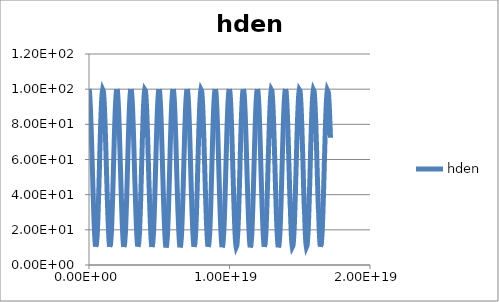
| Category | hden |
|---|---|
| 47421200000000.0 | 100 |
| 284527000000000.0 | 100 |
| 1232950000000000.0 | 99.996 |
| 5026650000000000.0 | 99.942 |
| 1.2007e+16 | 99.774 |
| 2.10816e+16 | 99.391 |
| 3.28784e+16 | 98.618 |
| 4.82144e+16 | 97.156 |
| 6.81511e+16 | 94.513 |
| 9.19197e+16 | 90.657 |
| 1.1692e+17 | 85.924 |
| 1.4192e+17 | 80.429 |
| 1.6692e+17 | 74.308 |
| 1.9192e+17 | 67.712 |
| 2.16501e+17 | 61.038 |
| 2.39133e+17 | 55.09 |
| 2.59097e+17 | 49.778 |
| 2.77106e+17 | 44.99 |
| 2.93684e+17 | 40.646 |
| 3.09152e+17 | 36.705 |
| 3.23729e+17 | 33.117 |
| 3.37601e+17 | 29.852 |
| 3.50903e+17 | 26.88 |
| 3.63764e+17 | 24.175 |
| 3.75989e+17 | 21.835 |
| 3.87677e+17 | 19.709 |
| 3.99209e+17 | 17.791 |
| 4.12395e+17 | 15.587 |
| 4.25562e+17 | 14.13 |
| 4.38707e+17 | 12.553 |
| 4.52783e+17 | 11.454 |
| 4.6807e+17 | 10.481 |
| 4.87942e+17 | 10.001 |
| 5.11675e+17 | 10.518 |
| 5.36675e+17 | 12.131 |
| 5.61675e+17 | 14.799 |
| 5.80268e+17 | 16.464 |
| 5.92436e+17 | 18.349 |
| 6.04271e+17 | 20.332 |
| 6.17516e+17 | 23.181 |
| 6.30871e+17 | 25.612 |
| 6.4437e+17 | 29.009 |
| 6.58497e+17 | 32.092 |
| 6.73441e+17 | 36.324 |
| 6.89322e+17 | 40.225 |
| 7.0402e+17 | 44.16 |
| 7.20723e+17 | 49.406 |
| 7.38614e+17 | 54.17 |
| 7.58051e+17 | 60.37 |
| 7.79392e+17 | 66.122 |
| 7.99955e+17 | 71.608 |
| 8.22662e+17 | 77.946 |
| 8.47662e+17 | 83.719 |
| 8.72662e+17 | 88.785 |
| 8.97662e+17 | 93.019 |
| 9.22662e+17 | 96.317 |
| 9.47662e+17 | 98.598 |
| 9.72662e+17 | 99.805 |
| 9.97662e+17 | 99.908 |
| 1.02266e+18 | 98.906 |
| 1.04766e+18 | 96.823 |
| 1.07266e+18 | 93.71 |
| 1.09766e+18 | 89.644 |
| 1.12266e+18 | 84.725 |
| 1.14766e+18 | 79.073 |
| 1.17266e+18 | 72.829 |
| 1.19766e+18 | 66.147 |
| 1.22156e+18 | 59.807 |
| 1.24313e+18 | 54.069 |
| 1.26244e+18 | 48.913 |
| 1.28e+18 | 44.245 |
| 1.29624e+18 | 40.006 |
| 1.31142e+18 | 36.152 |
| 1.32577e+18 | 32.639 |
| 1.33945e+18 | 29.44 |
| 1.35259e+18 | 26.524 |
| 1.3653e+18 | 23.875 |
| 1.37769e+18 | 21.468 |
| 1.38951e+18 | 19.409 |
| 1.40087e+18 | 17.539 |
| 1.41391e+18 | 15.393 |
| 1.42696e+18 | 13.971 |
| 1.44002e+18 | 12.435 |
| 1.45405e+18 | 11.364 |
| 1.46936e+18 | 10.429 |
| 1.48925e+18 | 10 |
| 1.513e+18 | 10.576 |
| 1.538e+18 | 12.246 |
| 1.563e+18 | 14.969 |
| 1.58167e+18 | 16.682 |
| 1.59368e+18 | 18.513 |
| 1.6071e+18 | 21.187 |
| 1.62046e+18 | 23.426 |
| 1.63372e+18 | 26.582 |
| 1.64752e+18 | 29.43 |
| 1.662e+18 | 33.368 |
| 1.67732e+18 | 36.988 |
| 1.69141e+18 | 40.653 |
| 1.70739e+18 | 45.576 |
| 1.72443e+18 | 50.047 |
| 1.74286e+18 | 55.928 |
| 1.76294e+18 | 61.37 |
| 1.78209e+18 | 66.619 |
| 1.80389e+18 | 73.185 |
| 1.82788e+18 | 79.004 |
| 1.85205e+18 | 84.663 |
| 1.87705e+18 | 89.592 |
| 1.90205e+18 | 93.668 |
| 1.92705e+18 | 96.793 |
| 1.95205e+18 | 98.888 |
| 1.97705e+18 | 99.903 |
| 2.00205e+18 | 99.812 |
| 2.02705e+18 | 98.618 |
| 2.05205e+18 | 96.349 |
| 2.07705e+18 | 93.063 |
| 2.10205e+18 | 88.839 |
| 2.12705e+18 | 83.782 |
| 2.15205e+18 | 78.017 |
| 2.17705e+18 | 71.684 |
| 2.20205e+18 | 64.941 |
| 2.22705e+18 | 57.953 |
| 2.24922e+18 | 52.487 |
| 2.26774e+18 | 47.519 |
| 2.28474e+18 | 43.017 |
| 2.30052e+18 | 38.925 |
| 2.31533e+18 | 35.198 |
| 2.32936e+18 | 31.802 |
| 2.34275e+18 | 28.708 |
| 2.35564e+18 | 25.889 |
| 2.36812e+18 | 23.325 |
| 2.3803e+18 | 20.998 |
| 2.39229e+18 | 18.885 |
| 2.40386e+18 | 17.087 |
| 2.41675e+18 | 15.03 |
| 2.42971e+18 | 13.657 |
| 2.44278e+18 | 12.188 |
| 2.45694e+18 | 11.164 |
| 2.47252e+18 | 10.309 |
| 2.49278e+18 | 10.016 |
| 2.51672e+18 | 10.757 |
| 2.54172e+18 | 12.587 |
| 2.56672e+18 | 15.461 |
| 2.58536e+18 | 17.233 |
| 2.59735e+18 | 19.133 |
| 2.61081e+18 | 21.892 |
| 2.62431e+18 | 24.236 |
| 2.63785e+18 | 27.532 |
| 2.65198e+18 | 30.521 |
| 2.66688e+18 | 34.646 |
| 2.68195e+18 | 38.067 |
| 2.69724e+18 | 42.687 |
| 2.71364e+18 | 46.957 |
| 2.73148e+18 | 52.616 |
| 2.74993e+18 | 57.345 |
| 2.76918e+18 | 63.447 |
| 2.78953e+18 | 68.636 |
| 2.81131e+18 | 75.083 |
| 2.83584e+18 | 81.001 |
| 2.86055e+18 | 86.427 |
| 2.88555e+18 | 91.078 |
| 2.91055e+18 | 94.841 |
| 2.93555e+18 | 97.624 |
| 2.96055e+18 | 99.356 |
| 2.98555e+18 | 99.997 |
| 3.01055e+18 | 99.529 |
| 3.03555e+18 | 97.965 |
| 3.06055e+18 | 95.343 |
| 3.08555e+18 | 91.728 |
| 3.11055e+18 | 87.208 |
| 3.13555e+18 | 81.895 |
| 3.16055e+18 | 75.92 |
| 3.18555e+18 | 69.43 |
| 3.21055e+18 | 62.585 |
| 3.23555e+18 | 55.553 |
| 3.26055e+18 | 48.507 |
| 3.28104e+18 | 44.072 |
| 3.29671e+18 | 39.924 |
| 3.31157e+18 | 36.154 |
| 3.32562e+18 | 32.715 |
| 3.339e+18 | 29.579 |
| 3.35185e+18 | 26.72 |
| 3.36427e+18 | 24.116 |
| 3.37636e+18 | 21.748 |
| 3.38823e+18 | 19.596 |
| 3.39999e+18 | 17.646 |
| 3.41348e+18 | 15.416 |
| 3.42664e+18 | 14.025 |
| 3.43937e+18 | 12.513 |
| 3.45303e+18 | 11.449 |
| 3.46793e+18 | 10.496 |
| 3.48728e+18 | 10.003 |
| 3.51072e+18 | 10.478 |
| 3.53572e+18 | 12.05 |
| 3.56072e+18 | 14.679 |
| 3.57924e+18 | 16.302 |
| 3.59123e+18 | 18.136 |
| 3.60316e+18 | 20.168 |
| 3.61685e+18 | 23.099 |
| 3.63065e+18 | 25.606 |
| 3.64459e+18 | 29.116 |
| 3.65922e+18 | 32.332 |
| 3.67261e+18 | 35.647 |
| 3.68786e+18 | 40.153 |
| 3.70396e+18 | 44.201 |
| 3.72114e+18 | 49.601 |
| 3.73885e+18 | 54.108 |
| 3.75723e+18 | 59.973 |
| 3.77676e+18 | 65.062 |
| 3.79776e+18 | 71.469 |
| 3.82095e+18 | 77.237 |
| 3.84476e+18 | 83.083 |
| 3.86976e+18 | 88.238 |
| 3.89476e+18 | 92.574 |
| 3.91976e+18 | 95.985 |
| 3.94476e+18 | 98.387 |
| 3.96976e+18 | 99.721 |
| 3.99476e+18 | 99.953 |
| 4.01976e+18 | 99.079 |
| 4.04476e+18 | 97.119 |
| 4.06976e+18 | 94.122 |
| 4.09476e+18 | 90.162 |
| 4.11976e+18 | 85.336 |
| 4.14476e+18 | 79.763 |
| 4.16976e+18 | 73.58 |
| 4.19476e+18 | 66.939 |
| 4.21976e+18 | 60.005 |
| 4.24476e+18 | 52.948 |
| 4.26976e+18 | 45.941 |
| 4.28979e+18 | 41.82 |
| 4.30462e+18 | 37.927 |
| 4.31884e+18 | 34.385 |
| 4.33232e+18 | 31.151 |
| 4.34522e+18 | 28.198 |
| 4.35765e+18 | 25.504 |
| 4.36971e+18 | 23.049 |
| 4.38149e+18 | 20.815 |
| 4.39309e+18 | 18.785 |
| 4.40463e+18 | 16.945 |
| 4.4179e+18 | 14.854 |
| 4.43095e+18 | 13.534 |
| 4.44372e+18 | 12.122 |
| 4.45761e+18 | 11.128 |
| 4.47297e+18 | 10.299 |
| 4.49294e+18 | 10.016 |
| 4.51673e+18 | 10.757 |
| 4.54173e+18 | 12.587 |
| 4.56673e+18 | 15.461 |
| 4.58505e+18 | 17.137 |
| 4.59844e+18 | 19.618 |
| 4.61191e+18 | 21.778 |
| 4.6255e+18 | 24.858 |
| 4.63953e+18 | 27.617 |
| 4.65207e+18 | 30.474 |
| 4.66631e+18 | 34.408 |
| 4.68117e+18 | 37.908 |
| 4.69686e+18 | 42.641 |
| 4.71364e+18 | 47.002 |
| 4.72917e+18 | 51.268 |
| 4.74668e+18 | 56.857 |
| 4.76529e+18 | 61.763 |
| 4.78535e+18 | 68.01 |
| 4.80757e+18 | 73.764 |
| 4.83095e+18 | 79.931 |
| 4.85595e+18 | 85.485 |
| 4.88095e+18 | 90.288 |
| 4.90595e+18 | 94.221 |
| 4.93095e+18 | 97.19 |
| 4.95595e+18 | 99.119 |
| 4.98095e+18 | 99.962 |
| 5.00595e+18 | 99.698 |
| 5.03095e+18 | 98.333 |
| 5.05595e+18 | 95.901 |
| 5.08095e+18 | 92.462 |
| 5.10595e+18 | 88.101 |
| 5.13095e+18 | 82.925 |
| 5.15595e+18 | 77.061 |
| 5.18095e+18 | 70.654 |
| 5.20595e+18 | 63.861 |
| 5.23095e+18 | 56.85 |
| 5.25595e+18 | 49.794 |
| 5.28095e+18 | 42.866 |
| 5.30527e+18 | 36.588 |
| 5.32343e+18 | 33.377 |
| 5.33802e+18 | 29.41 |
| 5.3522e+18 | 26.725 |
| 5.36405e+18 | 24.204 |
| 5.37573e+18 | 21.906 |
| 5.38719e+18 | 19.815 |
| 5.39851e+18 | 17.917 |
| 5.41148e+18 | 15.729 |
| 5.42448e+18 | 14.266 |
| 5.4375e+18 | 12.674 |
| 5.45102e+18 | 11.619 |
| 5.4652e+18 | 10.636 |
| 5.48363e+18 | 10.031 |
| 5.50655e+18 | 10.322 |
| 5.53155e+18 | 11.713 |
| 5.55655e+18 | 14.169 |
| 5.57546e+18 | 15.824 |
| 5.58804e+18 | 17.657 |
| 5.60031e+18 | 19.689 |
| 5.61434e+18 | 22.638 |
| 5.62847e+18 | 25.171 |
| 5.64068e+18 | 27.797 |
| 5.65449e+18 | 31.44 |
| 5.66884e+18 | 34.665 |
| 5.68387e+18 | 39.058 |
| 5.69914e+18 | 42.692 |
| 5.71471e+18 | 47.546 |
| 5.73116e+18 | 51.838 |
| 5.74875e+18 | 57.456 |
| 5.7676e+18 | 62.46 |
| 5.78809e+18 | 68.818 |
| 5.81075e+18 | 74.626 |
| 5.83433e+18 | 80.719 |
| 5.85933e+18 | 86.179 |
| 5.88433e+18 | 90.871 |
| 5.90933e+18 | 94.68 |
| 5.93433e+18 | 97.512 |
| 5.95933e+18 | 99.297 |
| 5.98433e+18 | 99.991 |
| 6.00933e+18 | 99.578 |
| 6.03433e+18 | 98.066 |
| 6.05933e+18 | 95.495 |
| 6.08433e+18 | 91.926 |
| 6.10933e+18 | 87.448 |
| 6.13433e+18 | 82.171 |
| 6.15933e+18 | 76.225 |
| 6.18433e+18 | 69.756 |
| 6.20933e+18 | 62.924 |
| 6.23433e+18 | 55.897 |
| 6.25933e+18 | 48.848 |
| 6.28421e+18 | 42.014 |
| 6.30782e+18 | 36.083 |
| 6.3295e+18 | 30.9 |
| 6.34572e+18 | 28.211 |
| 6.35898e+18 | 24.929 |
| 6.37182e+18 | 22.751 |
| 6.3841e+18 | 20.139 |
| 6.39624e+18 | 18.358 |
| 6.40818e+18 | 16.277 |
| 6.42045e+18 | 14.781 |
| 6.43314e+18 | 13.127 |
| 6.4465e+18 | 11.974 |
| 6.46073e+18 | 10.864 |
| 6.47922e+18 | 10.095 |
| 6.50217e+18 | 10.191 |
| 6.52717e+18 | 11.391 |
| 6.55217e+18 | 13.664 |
| 6.57152e+18 | 15.347 |
| 6.58471e+18 | 17.164 |
| 6.59725e+18 | 19.179 |
| 6.61155e+18 | 22.124 |
| 6.62523e+18 | 24.37 |
| 6.63814e+18 | 27.516 |
| 6.65163e+18 | 30.373 |
| 6.66589e+18 | 34.307 |
| 6.68024e+18 | 37.525 |
| 6.6947e+18 | 41.869 |
| 6.70989e+18 | 45.712 |
| 6.72604e+18 | 50.812 |
| 6.74331e+18 | 55.411 |
| 6.76204e+18 | 61.376 |
| 6.78237e+18 | 66.77 |
| 6.80462e+18 | 73.42 |
| 6.82875e+18 | 79.201 |
| 6.85287e+18 | 84.838 |
| 6.87787e+18 | 89.74 |
| 6.90287e+18 | 93.787 |
| 6.92787e+18 | 96.879 |
| 6.95287e+18 | 98.939 |
| 6.97787e+18 | 99.918 |
| 7.00287e+18 | 99.79 |
| 7.02787e+18 | 98.56 |
| 7.05287e+18 | 96.257 |
| 7.07787e+18 | 92.938 |
| 7.10287e+18 | 88.685 |
| 7.12787e+18 | 83.603 |
| 7.15287e+18 | 77.816 |
| 7.17787e+18 | 71.467 |
| 7.20287e+18 | 64.714 |
| 7.22787e+18 | 57.72 |
| 7.25287e+18 | 50.66 |
| 7.2775e+18 | 43.911 |
| 7.30063e+18 | 38.006 |
| 7.32187e+18 | 32.8 |
| 7.34178e+18 | 28.22 |
| 7.35691e+18 | 25.802 |
| 7.36948e+18 | 22.866 |
| 7.38172e+18 | 20.9 |
| 7.39354e+18 | 18.558 |
| 7.40529e+18 | 16.95 |
| 7.41697e+18 | 15.09 |
| 7.42898e+18 | 13.769 |
| 7.44144e+18 | 12.337 |
| 7.45498e+18 | 11.312 |
| 7.46991e+18 | 10.416 |
| 7.48932e+18 | 10 |
| 7.51279e+18 | 10.567 |
| 7.53779e+18 | 12.228 |
| 7.56279e+18 | 14.942 |
| 7.58162e+18 | 16.698 |
| 7.59618e+18 | 19.34 |
| 7.61064e+18 | 21.597 |
| 7.6227e+18 | 23.892 |
| 7.6361e+18 | 27.123 |
| 7.64988e+18 | 29.963 |
| 7.66215e+18 | 32.878 |
| 7.67608e+18 | 36.857 |
| 7.69046e+18 | 40.278 |
| 7.70541e+18 | 44.869 |
| 7.72134e+18 | 49.027 |
| 7.73853e+18 | 54.507 |
| 7.75708e+18 | 59.492 |
| 7.77739e+18 | 65.88 |
| 7.79897e+18 | 71.323 |
| 7.82158e+18 | 77.682 |
| 7.84658e+18 | 83.483 |
| 7.87158e+18 | 88.582 |
| 7.89658e+18 | 92.854 |
| 7.92158e+18 | 96.195 |
| 7.94658e+18 | 98.521 |
| 7.97158e+18 | 99.775 |
| 7.99658e+18 | 99.927 |
| 8.02158e+18 | 98.972 |
| 8.04658e+18 | 96.935 |
| 8.07158e+18 | 93.865 |
| 8.09658e+18 | 89.839 |
| 8.12158e+18 | 84.954 |
| 8.14658e+18 | 79.332 |
| 8.17158e+18 | 73.111 |
| 8.19658e+18 | 66.443 |
| 8.22158e+18 | 59.494 |
| 8.24658e+18 | 52.435 |
| 8.27085e+18 | 45.839 |
| 8.29331e+18 | 40.023 |
| 8.31394e+18 | 34.851 |
| 8.33327e+18 | 30.256 |
| 8.35163e+18 | 26.184 |
| 8.36928e+18 | 22.594 |
| 8.383e+18 | 20.684 |
| 8.39458e+18 | 18.408 |
| 8.40616e+18 | 16.825 |
| 8.41775e+18 | 14.996 |
| 8.42961e+18 | 13.71 |
| 8.44182e+18 | 12.315 |
| 8.45498e+18 | 11.328 |
| 8.46937e+18 | 10.449 |
| 8.48807e+18 | 10.002 |
| 8.51115e+18 | 10.496 |
| 8.53615e+18 | 12.086 |
| 8.56115e+18 | 14.732 |
| 8.58026e+18 | 16.539 |
| 8.59268e+18 | 18.343 |
| 8.60602e+18 | 20.979 |
| 8.61931e+18 | 23.193 |
| 8.63253e+18 | 26.317 |
| 8.64561e+18 | 28.828 |
| 8.6585e+18 | 32.286 |
| 8.67195e+18 | 35.355 |
| 8.6861e+18 | 39.519 |
| 8.70105e+18 | 43.26 |
| 8.71702e+18 | 48.253 |
| 8.73369e+18 | 52.552 |
| 8.75128e+18 | 58.169 |
| 8.76991e+18 | 63.044 |
| 8.78991e+18 | 69.23 |
| 8.81186e+18 | 74.801 |
| 8.83501e+18 | 80.879 |
| 8.86001e+18 | 86.319 |
| 8.88501e+18 | 90.988 |
| 8.91001e+18 | 94.771 |
| 8.93501e+18 | 97.575 |
| 8.96001e+18 | 99.331 |
| 8.98501e+18 | 99.995 |
| 9.01001e+18 | 99.55 |
| 9.03501e+18 | 98.009 |
| 9.06001e+18 | 95.409 |
| 9.08501e+18 | 91.814 |
| 9.11001e+18 | 87.313 |
| 9.13501e+18 | 82.016 |
| 9.16001e+18 | 76.053 |
| 9.18501e+18 | 69.572 |
| 9.21001e+18 | 62.733 |
| 9.23501e+18 | 55.703 |
| 9.25916e+18 | 49.135 |
| 9.28128e+18 | 43.328 |
| 9.30145e+18 | 38.133 |
| 9.32027e+18 | 33.474 |
| 9.33807e+18 | 29.298 |
| 9.35512e+18 | 25.564 |
| 9.37163e+18 | 22.241 |
| 9.38779e+18 | 19.303 |
| 9.40063e+18 | 17.709 |
| 9.41172e+18 | 15.843 |
| 9.42308e+18 | 14.505 |
| 9.43479e+18 | 13.014 |
| 9.44712e+18 | 11.963 |
| 9.46023e+18 | 10.927 |
| 9.47727e+18 | 10.152 |
| 9.4994e+18 | 10.126 |
| 9.5244e+18 | 11.204 |
| 9.5494e+18 | 13.361 |
| 9.5744e+18 | 16.543 |
| 9.59244e+18 | 18.262 |
| 9.60518e+18 | 20.76 |
| 9.61832e+18 | 23.033 |
| 9.62985e+18 | 25.332 |
| 9.64269e+18 | 28.537 |
| 9.65585e+18 | 31.311 |
| 9.66945e+18 | 35.11 |
| 9.6837e+18 | 38.504 |
| 9.6988e+18 | 43.08 |
| 9.71444e+18 | 46.998 |
| 9.73079e+18 | 52.182 |
| 9.74797e+18 | 56.673 |
| 9.76625e+18 | 62.48 |
| 9.78623e+18 | 67.792 |
| 9.80837e+18 | 74.383 |
| 9.8327e+18 | 80.184 |
| 9.85703e+18 | 85.708 |
| 9.88203e+18 | 90.475 |
| 9.90703e+18 | 94.37 |
| 9.93203e+18 | 97.294 |
| 9.95703e+18 | 99.178 |
| 9.98203e+18 | 99.973 |
| 1.0007e+19 | 99.662 |
| 1.0032e+19 | 98.25 |
| 1.0057e+19 | 95.774 |
| 1.0082e+19 | 92.293 |
| 1.0107e+19 | 87.894 |
| 1.0132e+19 | 82.686 |
| 1.0157e+19 | 76.795 |
| 1.0182e+19 | 70.368 |
| 1.0207e+19 | 63.563 |
| 1.0232e+19 | 56.546 |
| 1.02555e+19 | 50.341 |
| 1.02764e+19 | 44.825 |
| 1.02954e+19 | 39.87 |
| 1.03132e+19 | 35.396 |
| 1.03299e+19 | 31.352 |
| 1.03459e+19 | 27.695 |
| 1.03614e+19 | 24.397 |
| 1.03765e+19 | 21.434 |
| 1.03914e+19 | 18.787 |
| 1.04085e+19 | 15.821 |
| 1.04257e+19 | 13.902 |
| 1.04383e+19 | 12.821 |
| 1.04499e+19 | 11.67 |
| 1.04629e+19 | 10.831 |
| 1.04777e+19 | 10.172 |
| 1.0497e+19 | 10.055 |
| 1.05203e+19 | 10.954 |
| 1.05453e+19 | 12.939 |
| 1.05703e+19 | 15.959 |
| 1.05887e+19 | 17.716 |
| 1.06001e+19 | 19.55 |
| 1.06128e+19 | 22.188 |
| 1.06255e+19 | 24.403 |
| 1.06382e+19 | 27.5 |
| 1.06513e+19 | 30.24 |
| 1.0665e+19 | 34.007 |
| 1.06791e+19 | 37.219 |
| 1.06935e+19 | 41.557 |
| 1.07088e+19 | 45.443 |
| 1.07252e+19 | 50.605 |
| 1.07426e+19 | 55.224 |
| 1.07614e+19 | 61.219 |
| 1.07816e+19 | 66.501 |
| 1.08035e+19 | 73.11 |
| 1.08278e+19 | 79.027 |
| 1.08521e+19 | 84.683 |
| 1.08771e+19 | 89.609 |
| 1.09021e+19 | 93.682 |
| 1.09271e+19 | 96.803 |
| 1.09521e+19 | 98.894 |
| 1.09771e+19 | 99.905 |
| 1.10021e+19 | 99.81 |
| 1.10271e+19 | 98.611 |
| 1.10521e+19 | 96.339 |
| 1.10771e+19 | 93.049 |
| 1.11021e+19 | 88.822 |
| 1.11271e+19 | 83.762 |
| 1.11521e+19 | 77.994 |
| 1.11771e+19 | 71.659 |
| 1.12021e+19 | 64.915 |
| 1.12271e+19 | 57.926 |
| 1.12521e+19 | 50.866 |
| 1.12746e+19 | 45.291 |
| 1.12938e+19 | 40.295 |
| 1.13115e+19 | 35.818 |
| 1.13274e+19 | 32.145 |
| 1.13419e+19 | 28.773 |
| 1.13559e+19 | 25.703 |
| 1.13696e+19 | 22.913 |
| 1.1383e+19 | 20.383 |
| 1.13964e+19 | 18.098 |
| 1.14117e+19 | 15.517 |
| 1.14272e+19 | 13.809 |
| 1.14429e+19 | 12.044 |
| 1.14604e+19 | 10.851 |
| 1.14801e+19 | 10.068 |
| 1.15038e+19 | 10.235 |
| 1.15288e+19 | 11.505 |
| 1.15538e+19 | 13.846 |
| 1.15726e+19 | 15.416 |
| 1.15849e+19 | 17.13 |
| 1.15966e+19 | 18.995 |
| 1.16082e+19 | 21.049 |
| 1.16215e+19 | 23.985 |
| 1.16349e+19 | 26.488 |
| 1.16485e+19 | 29.975 |
| 1.16623e+19 | 32.951 |
| 1.16765e+19 | 37.016 |
| 1.16915e+19 | 40.659 |
| 1.17074e+19 | 45.552 |
| 1.17242e+19 | 49.937 |
| 1.17423e+19 | 55.704 |
| 1.17617e+19 | 60.88 |
| 1.17828e+19 | 67.481 |
| 1.18059e+19 | 73.387 |
| 1.18295e+19 | 79.586 |
| 1.18545e+19 | 85.179 |
| 1.18795e+19 | 90.029 |
| 1.19045e+19 | 94.017 |
| 1.19295e+19 | 97.044 |
| 1.19545e+19 | 99.036 |
| 1.19795e+19 | 99.943 |
| 1.20045e+19 | 99.744 |
| 1.20295e+19 | 98.443 |
| 1.20545e+19 | 96.072 |
| 1.20795e+19 | 92.69 |
| 1.21045e+19 | 88.38 |
| 1.21295e+19 | 83.248 |
| 1.21545e+19 | 77.42 |
| 1.21795e+19 | 71.041 |
| 1.22045e+19 | 64.266 |
| 1.22295e+19 | 57.263 |
| 1.22545e+19 | 50.205 |
| 1.22781e+19 | 44.004 |
| 1.22989e+19 | 38.8 |
| 1.23173e+19 | 34.299 |
| 1.23337e+19 | 30.585 |
| 1.23484e+19 | 27.306 |
| 1.23622e+19 | 24.423 |
| 1.23754e+19 | 21.84 |
| 1.23878e+19 | 19.669 |
| 1.24014e+19 | 17.14 |
| 1.24149e+19 | 15.46 |
| 1.24266e+19 | 13.992 |
| 1.244e+19 | 12.414 |
| 1.24544e+19 | 11.336 |
| 1.24699e+19 | 10.404 |
| 1.24901e+19 | 10.002 |
| 1.25139e+19 | 10.62 |
| 1.25389e+19 | 12.331 |
| 1.25639e+19 | 15.092 |
| 1.25833e+19 | 17.04 |
| 1.25967e+19 | 19.14 |
| 1.26096e+19 | 21.422 |
| 1.26242e+19 | 24.705 |
| 1.2639e+19 | 27.559 |
| 1.26542e+19 | 31.546 |
| 1.26699e+19 | 35.098 |
| 1.26864e+19 | 39.951 |
| 1.27038e+19 | 44.307 |
| 1.27223e+19 | 50.125 |
| 1.2742e+19 | 55.354 |
| 1.27633e+19 | 62.134 |
| 1.27864e+19 | 68.219 |
| 1.28064e+19 | 72.96 |
| 1.28235e+19 | 77.097 |
| 1.28396e+19 | 80.876 |
| 1.2855e+19 | 84.245 |
| 1.28695e+19 | 87.089 |
| 1.28828e+19 | 89.535 |
| 1.28952e+19 | 91.607 |
| 1.2907e+19 | 93.413 |
| 1.29184e+19 | 94.968 |
| 1.29296e+19 | 96.323 |
| 1.29425e+19 | 97.778 |
| 1.2957e+19 | 98.871 |
| 1.29737e+19 | 99.747 |
| 1.29954e+19 | 99.949 |
| 1.30201e+19 | 99.059 |
| 1.30451e+19 | 97.085 |
| 1.30701e+19 | 94.075 |
| 1.30951e+19 | 90.102 |
| 1.31201e+19 | 85.265 |
| 1.31451e+19 | 79.683 |
| 1.31701e+19 | 73.493 |
| 1.31951e+19 | 66.848 |
| 1.32201e+19 | 59.911 |
| 1.32451e+19 | 52.853 |
| 1.32701e+19 | 45.848 |
| 1.32951e+19 | 39.068 |
| 1.33201e+19 | 32.68 |
| 1.33451e+19 | 26.843 |
| 1.3369e+19 | 22.118 |
| 1.3391e+19 | 18.332 |
| 1.34117e+19 | 15.309 |
| 1.3432e+19 | 12.95 |
| 1.3453e+19 | 11.155 |
| 1.34764e+19 | 10.11 |
| 1.35014e+19 | 10.171 |
| 1.35264e+19 | 11.335 |
| 1.35514e+19 | 13.574 |
| 1.35743e+19 | 16.219 |
| 1.35932e+19 | 18.879 |
| 1.36098e+19 | 21.78 |
| 1.36258e+19 | 24.968 |
| 1.3644e+19 | 29.553 |
| 1.36623e+19 | 33.394 |
| 1.36807e+19 | 38.705 |
| 1.36998e+19 | 43.396 |
| 1.37198e+19 | 49.696 |
| 1.37411e+19 | 55.273 |
| 1.37635e+19 | 62.309 |
| 1.37877e+19 | 68.735 |
| 1.38119e+19 | 75.269 |
| 1.38369e+19 | 81.305 |
| 1.38619e+19 | 86.692 |
| 1.38869e+19 | 91.3 |
| 1.39119e+19 | 95.013 |
| 1.39369e+19 | 97.742 |
| 1.39619e+19 | 99.417 |
| 1.39869e+19 | 100 |
| 1.40119e+19 | 99.474 |
| 1.40369e+19 | 97.853 |
| 1.40619e+19 | 95.177 |
| 1.40869e+19 | 91.511 |
| 1.41119e+19 | 86.947 |
| 1.41369e+19 | 81.596 |
| 1.41619e+19 | 75.59 |
| 1.41869e+19 | 69.077 |
| 1.42119e+19 | 62.217 |
| 1.42369e+19 | 55.18 |
| 1.42619e+19 | 48.138 |
| 1.42869e+19 | 41.265 |
| 1.43119e+19 | 34.731 |
| 1.43279e+19 | 32.953 |
| 1.43331e+19 | 32.156 |
| 1.4336e+19 | 31.529 |
| 1.4339e+19 | 30.723 |
| 1.43429e+19 | 29.691 |
| 1.43479e+19 | 28.378 |
| 1.43544e+19 | 26.723 |
| 1.43629e+19 | 24.663 |
| 1.4374e+19 | 22.15 |
| 1.43884e+19 | 19.189 |
| 1.44069e+19 | 15.933 |
| 1.44275e+19 | 13.417 |
| 1.44483e+19 | 11.483 |
| 1.44715e+19 | 10.227 |
| 1.44965e+19 | 10.072 |
| 1.45215e+19 | 11.024 |
| 1.45465e+19 | 13.058 |
| 1.45715e+19 | 16.125 |
| 1.45919e+19 | 18.573 |
| 1.46075e+19 | 21.256 |
| 1.46225e+19 | 24.187 |
| 1.46396e+19 | 28.397 |
| 1.46567e+19 | 31.882 |
| 1.46737e+19 | 36.706 |
| 1.46914e+19 | 40.94 |
| 1.47099e+19 | 46.651 |
| 1.47293e+19 | 51.669 |
| 1.47499e+19 | 58.247 |
| 1.47718e+19 | 64.04 |
| 1.47947e+19 | 70.824 |
| 1.48196e+19 | 77.199 |
| 1.48446e+19 | 83.049 |
| 1.48696e+19 | 88.208 |
| 1.48946e+19 | 92.55 |
| 1.49196e+19 | 95.967 |
| 1.49446e+19 | 98.376 |
| 1.49696e+19 | 99.716 |
| 1.49946e+19 | 99.955 |
| 1.50196e+19 | 99.087 |
| 1.50446e+19 | 97.134 |
| 1.50696e+19 | 94.144 |
| 1.50946e+19 | 90.189 |
| 1.51196e+19 | 85.368 |
| 1.51446e+19 | 79.799 |
| 1.51696e+19 | 73.62 |
| 1.51946e+19 | 66.982 |
| 1.52196e+19 | 60.049 |
| 1.52446e+19 | 52.992 |
| 1.52696e+19 | 45.984 |
| 1.52946e+19 | 39.198 |
| 1.53196e+19 | 32.801 |
| 1.53352e+19 | 31.282 |
| 1.53396e+19 | 30.68 |
| 1.53425e+19 | 29.908 |
| 1.53463e+19 | 28.92 |
| 1.53511e+19 | 27.663 |
| 1.53575e+19 | 26.079 |
| 1.53658e+19 | 24.108 |
| 1.53765e+19 | 21.705 |
| 1.53904e+19 | 18.872 |
| 1.54086e+19 | 15.724 |
| 1.5429e+19 | 13.251 |
| 1.54499e+19 | 11.363 |
| 1.54732e+19 | 10.181 |
| 1.54982e+19 | 10.102 |
| 1.55232e+19 | 11.129 |
| 1.55482e+19 | 13.236 |
| 1.55732e+19 | 16.371 |
| 1.55928e+19 | 18.567 |
| 1.56068e+19 | 20.998 |
| 1.56205e+19 | 23.636 |
| 1.56361e+19 | 27.403 |
| 1.56517e+19 | 30.513 |
| 1.56672e+19 | 34.815 |
| 1.56832e+19 | 38.558 |
| 1.56999e+19 | 43.622 |
| 1.57173e+19 | 48.05 |
| 1.57357e+19 | 53.905 |
| 1.57552e+19 | 59.041 |
| 1.57761e+19 | 65.63 |
| 1.57986e+19 | 71.341 |
| 1.58216e+19 | 77.699 |
| 1.58466e+19 | 83.498 |
| 1.58716e+19 | 88.595 |
| 1.58966e+19 | 92.865 |
| 1.59216e+19 | 96.203 |
| 1.59466e+19 | 98.526 |
| 1.59716e+19 | 99.777 |
| 1.59966e+19 | 99.926 |
| 1.60216e+19 | 98.968 |
| 1.60466e+19 | 96.928 |
| 1.60716e+19 | 93.856 |
| 1.60966e+19 | 89.826 |
| 1.61216e+19 | 84.939 |
| 1.61466e+19 | 79.315 |
| 1.61716e+19 | 73.093 |
| 1.61966e+19 | 66.424 |
| 1.62216e+19 | 59.475 |
| 1.62466e+19 | 52.415 |
| 1.62716e+19 | 45.419 |
| 1.62966e+19 | 38.659 |
| 1.63216e+19 | 32.301 |
| 1.63373e+19 | 30.793 |
| 1.63412e+19 | 30.402 |
| 1.63424e+19 | 30.235 |
| 1.63432e+19 | 30.017 |
| 1.63443e+19 | 29.736 |
| 1.63457e+19 | 29.372 |
| 1.63474e+19 | 28.904 |
| 1.63498e+19 | 28.3 |
| 1.63528e+19 | 27.527 |
| 1.63567e+19 | 26.541 |
| 1.63619e+19 | 25.292 |
| 1.63685e+19 | 23.728 |
| 1.63772e+19 | 21.8 |
| 1.63884e+19 | 19.482 |
| 1.6403e+19 | 16.808 |
| 1.64216e+19 | 14.048 |
| 1.64424e+19 | 11.967 |
| 1.64647e+19 | 10.487 |
| 1.64891e+19 | 10.002 |
| 1.65141e+19 | 10.626 |
| 1.65391e+19 | 12.342 |
| 1.65641e+19 | 15.109 |
| 1.6583e+19 | 16.913 |
| 1.65956e+19 | 18.882 |
| 1.66077e+19 | 21.018 |
| 1.66198e+19 | 23.332 |
| 1.66335e+19 | 26.607 |
| 1.66474e+19 | 29.327 |
| 1.66612e+19 | 33.081 |
| 1.66755e+19 | 36.359 |
| 1.66905e+19 | 40.802 |
| 1.67061e+19 | 44.702 |
| 1.67226e+19 | 49.893 |
| 1.674e+19 | 54.452 |
| 1.67586e+19 | 60.38 |
| 1.67781e+19 | 65.424 |
| 1.6799e+19 | 71.769 |
| 1.68213e+19 | 77.139 |
| 1.68444e+19 | 82.995 |
| 1.68691e+19 | 88.056 |
| 1.68938e+19 | 92.425 |
| 1.69184e+19 | 95.777 |
| 1.69419e+19 | 98.074 |
| 1.6964e+19 | 99.434 |
| 1.69849e+19 | 99.977 |
| 1.70044e+19 | 99.831 |
| 1.70224e+19 | 99.147 |
| 1.70389e+19 | 98.073 |
| 1.70515e+19 | 97.214 |
| 1.70625e+19 | 95.87 |
| 1.70768e+19 | 93.752 |
| 1.70916e+19 | 91.671 |
| 1.71047e+19 | 89.504 |
| 1.71166e+19 | 87.363 |
| 1.71271e+19 | 85.402 |
| 1.7136e+19 | 83.657 |
| 1.71437e+19 | 82.091 |
| 1.71499e+19 | 80.843 |
| 1.71546e+19 | 79.916 |
| 1.71582e+19 | 79.18 |
| 1.71611e+19 | 78.512 |
| 1.71638e+19 | 77.868 |
| 1.71664e+19 | 77.265 |
| 1.71687e+19 | 76.723 |
| 1.71708e+19 | 76.233 |
| 1.71727e+19 | 75.778 |
| 1.71745e+19 | 75.347 |
| 1.71761e+19 | 74.937 |
| 1.71775e+19 | 74.663 |
| 1.71785e+19 | 74.437 |
| 1.71794e+19 | 74.191 |
| 1.71804e+19 | 73.918 |
| 1.71815e+19 | 73.643 |
| 1.71825e+19 | 73.381 |
| 1.71835e+19 | 73.128 |
| 1.71845e+19 | 72.877 |
| 1.71855e+19 | 72.625 |
| 1.71864e+19 | 72.376 |
| 1.71874e+19 | 72.124 |
| 1.71883e+19 | 71.878 |